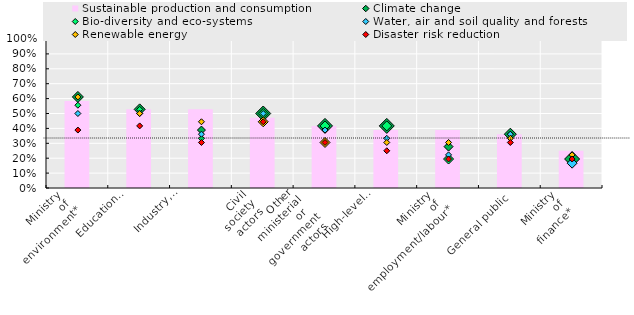
| Category | Sustainable production and consumption |
|---|---|
| Ministry
 of
 environment* | 0.583 |
| Education
sector
actors | 0.528 |
| Industry,
business
and
employers | 0.528 |
| Civil
society
actors | 0.472 |
| Other
ministerial
or 
government
actors | 0.417 |
| High-level
political
leadership | 0.389 |
| Ministry
of
employment/labour* | 0.389 |
| General public | 0.361 |
| Ministry
of
finance* | 0.25 |